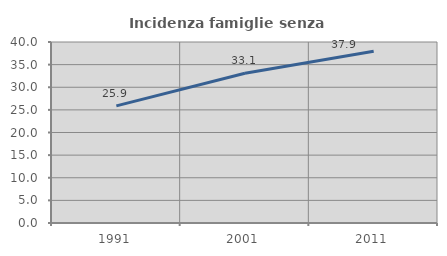
| Category | Incidenza famiglie senza nuclei |
|---|---|
| 1991.0 | 25.892 |
| 2001.0 | 33.087 |
| 2011.0 | 37.935 |